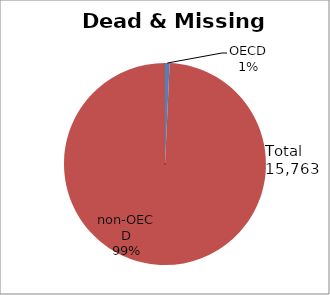
| Category | Series 0 |
|---|---|
| OECD | 116 |
| non-OECD | 15647 |